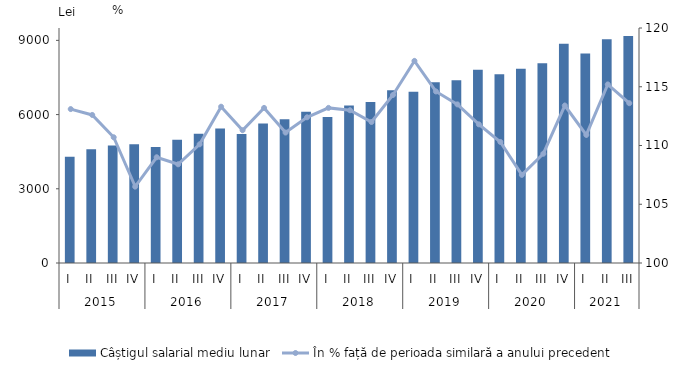
| Category | Câștigul salarial mediu lunar |
|---|---|
| 0 | 4300.2 |
| 1 | 4594.2 |
| 2 | 4749.2 |
| 3 | 4800.8 |
| 4 | 4689.2 |
| 5 | 4980.7 |
| 6 | 5229.2 |
| 7 | 5437.4 |
| 8 | 5218.9 |
| 9 | 5636.7 |
| 10 | 5809.1 |
| 11 | 6113.6 |
| 12 | 5906.5 |
| 13 | 6369.8 |
| 14 | 6507.3 |
| 15 | 6987.5 |
| 16 | 6923 |
| 17 | 7302.6 |
| 18 | 7385 |
| 19 | 7813.1 |
| 20 | 7633.9 |
| 21 | 7849 |
| 22 | 8074.3 |
| 23 | 8859.9 |
| 24 | 8468.6 |
| 25 | 9044.5 |
| 26 | 9175.7 |